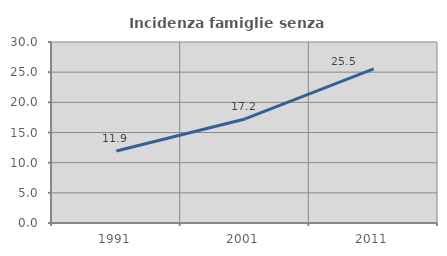
| Category | Incidenza famiglie senza nuclei |
|---|---|
| 1991.0 | 11.927 |
| 2001.0 | 17.243 |
| 2011.0 | 25.536 |